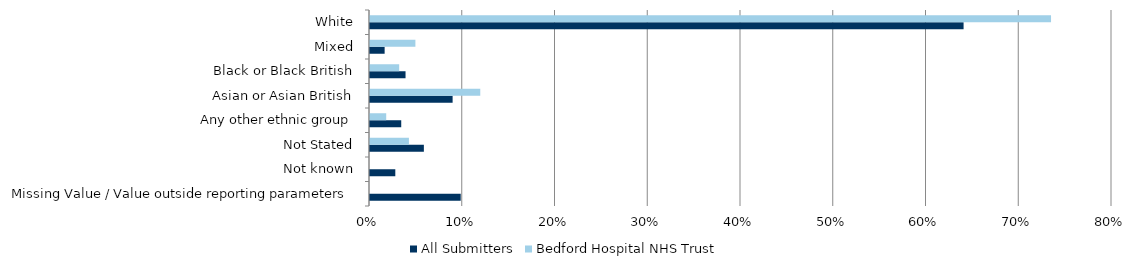
| Category | All Submitters | Bedford Hospital NHS Trust |
|---|---|---|
| Missing Value / Value outside reporting parameters | 0.098 | 0 |
| Not known | 0.027 | 0 |
| Not Stated | 0.058 | 0.042 |
| Any other ethnic group | 0.034 | 0.017 |
| Asian or Asian British | 0.089 | 0.119 |
| Black or Black British | 0.038 | 0.031 |
| Mixed | 0.016 | 0.049 |
| White | 0.64 | 0.734 |